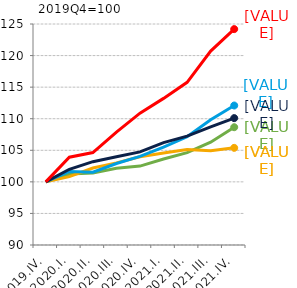
| Category | Északi országok | Mediterrán országok | KKE-régió | Magországok | Magyarország |
|---|---|---|---|---|---|
| 2019.IV. | 100 | 100 | 100 | 100 | 100 |
| 2020.I. | 101.225 | 100.832 | 101.649 | 101.992 | 103.911 |
| 2020.II. | 101.399 | 102.187 | 101.537 | 103.198 | 104.634 |
| 2020.III. | 102.164 | 103.009 | 102.902 | 103.981 | 107.885 |
| 2020.IV. | 102.495 | 103.968 | 104.041 | 104.75 | 110.88 |
| 2021.I. | 103.617 | 104.582 | 105.507 | 106.221 | 113.218 |
| 2021.II. | 104.633 | 105.132 | 107.143 | 107.244 | 115.757 |
| 2021.III. | 106.278 | 104.934 | 109.837 | 108.722 | 120.704 |
| 2021.IV. | 108.654 | 105.385 | 112.09 | 110.095 | 124.191 |